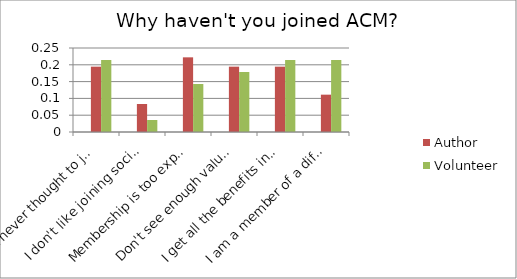
| Category | Series 0 | Author | Volunteer |
|---|---|---|---|
| Just never thought to join |  | 0.194 | 0.214 |
| I don't like joining societies or associations |  | 0.083 | 0.036 |
| Membership is too expensive |  | 0.222 | 0.143 |
| Don't see enough value in being a member |  | 0.194 | 0.179 |
| I get all the benefits in other ways (e.g., through my employer or school) |  | 0.194 | 0.214 |
| I am a member of a different society I think better matches my professional needs |  | 0.111 | 0.214 |